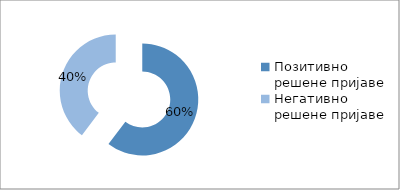
| Category | Series 0 |
|---|---|
| Позитивно решене пријаве | 7307 |
| Негативно решене пријаве | 4809 |